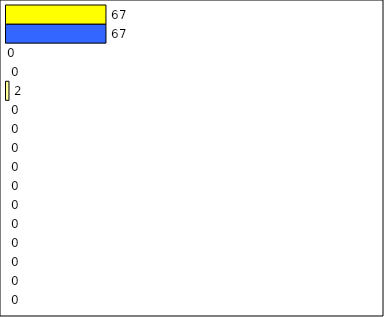
| Category | -2 | -1 | 0 | 1 | 2 | 3 | 4 | 5 | 6 | 7 | 8 | 9 | 10 | 11 | 12 | Perfect Round |
|---|---|---|---|---|---|---|---|---|---|---|---|---|---|---|---|---|
| 0 | 0 | 0 | 0 | 0 | 0 | 0 | 0 | 0 | 0 | 0 | 0 | 2 | 0 | 0 | 67 | 67 |